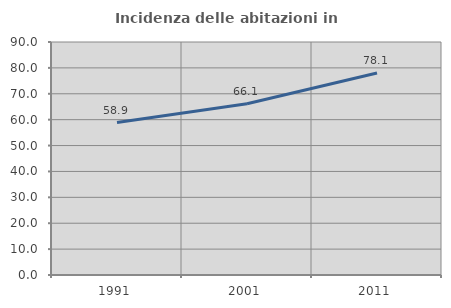
| Category | Incidenza delle abitazioni in proprietà  |
|---|---|
| 1991.0 | 58.865 |
| 2001.0 | 66.14 |
| 2011.0 | 78.057 |